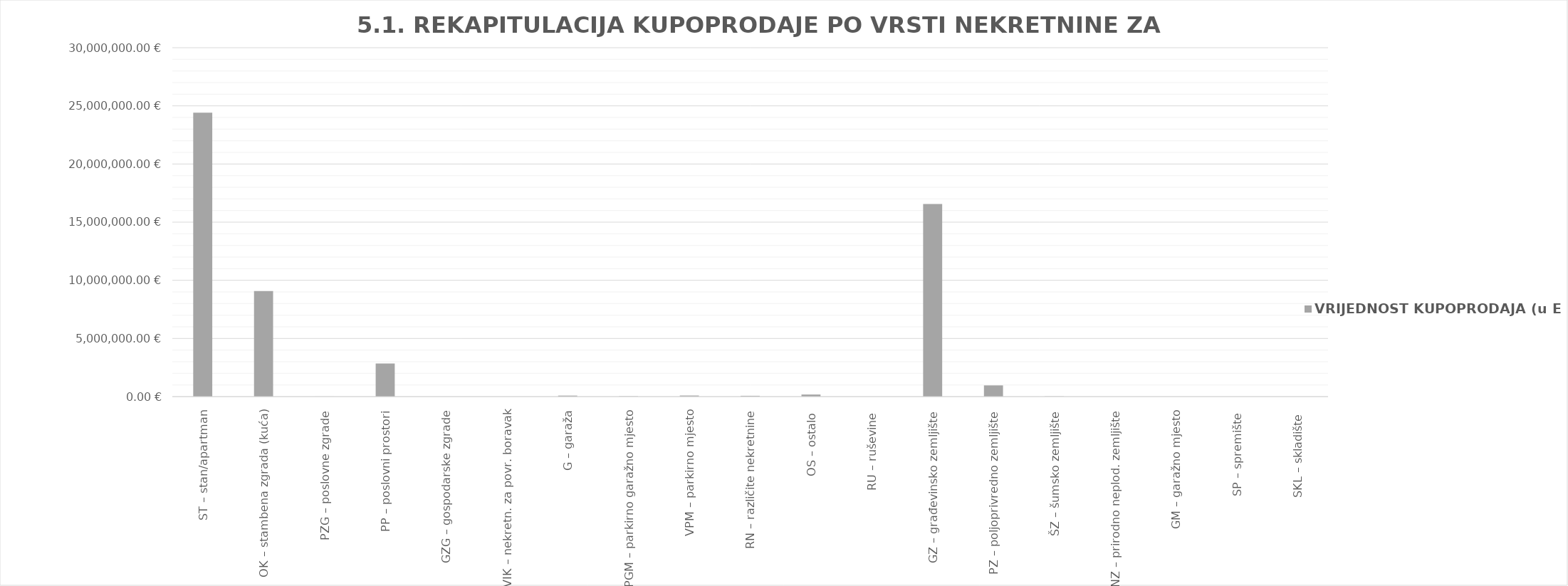
| Category | VRIJEDNOST KUPOPRODAJA (u EUR) |
|---|---|
| ST – stan/apartman | 24409501.942 |
| OK – stambena zgrada (kuća) | 9075709.764 |
| PZG – poslovne zgrade | 3318.07 |
| PP – poslovni prostori | 2853011.385 |
| GZG – gospodarske zgrade | 0 |
| VIK – nekretn. za povr. boravak | 0 |
| G – garaža | 85450.111 |
| PGM – parkirno garažno mjesto | 25970.959 |
| VPM – parkirno mjesto | 92413.773 |
| RN – različite nekretnine | 69871.885 |
| OS – ostalo  | 179631.516 |
| RU – ruševine  | 0 |
| GZ – građevinsko zemljište | 16560826.622 |
| PZ – poljoprivredno zemljište | 962443.257 |
| ŠZ – šumsko zemljište | 17312.744 |
| PNZ – prirodno neplod. zemljište | 0 |
| GM – garažno mjesto | 0 |
| SP – spremište  | 0 |
| SKL – skladište  | 0 |